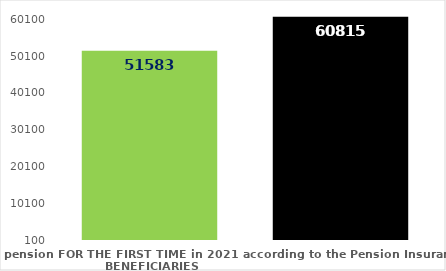
| Category | broj korisnika |
|---|---|
| Pension beneficiaries entitled to pension FOR THE FIRST TIME in 2021 according to the Pension Insurance Act  - NEW BENEFICIARIES | 51583 |
| Pension beneficiaries whose pension entitlement ceased in 2021  -  death caused,   
and who were retired according to the Pension Insurance Act   | 60815 |